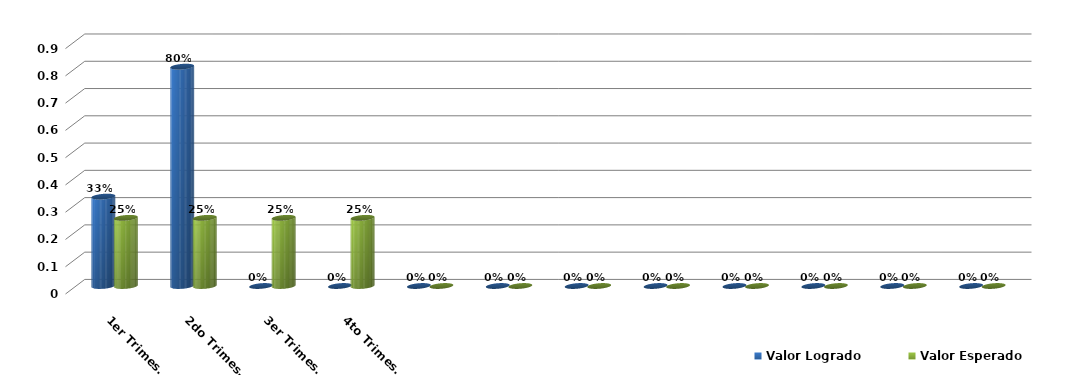
| Category | Valor Logrado | Valor Esperado |
|---|---|---|
| 1er Trimestre | 0.328 | 0.25 |
| 2do Trimestre | 0.804 | 0.25 |
| 3er Trimestre | 0 | 0.25 |
| 4to Trimestre | 0 | 0.25 |